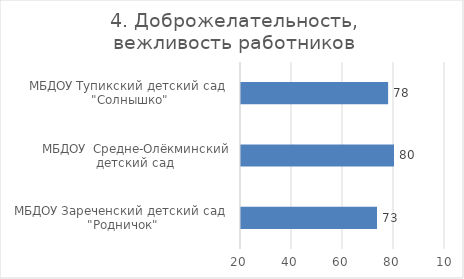
| Category | 4. Доброжелательность, вежливость работников |
|---|---|
| МБДОУ Зареченский детский сад  "Родничок" | 73.333 |
| МБДОУ  Средне-Олёкминский детский сад  | 80 |
| МБДОУ Тупикский детский сад  "Солнышко" | 77.692 |